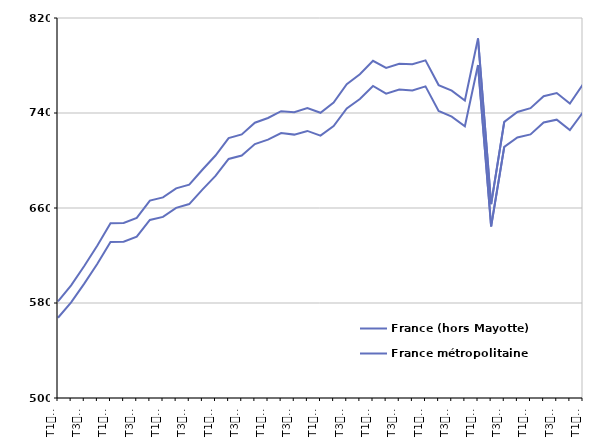
| Category | France (hors Mayotte) | France métropolitaine |
|---|---|---|
| T1
2012 | 581.4 | 567.6 |
| T2
2012 | 594.9 | 580.5 |
| T3
2012 | 611.2 | 596.3 |
| T4
2012 | 628.4 | 613 |
| T1
2013 | 647.1 | 631.4 |
| T2
2013 | 647.4 | 631.6 |
| T3
2013 | 651.7 | 635.8 |
| T4
2013 | 666.2 | 649.9 |
| T1
2014 | 668.9 | 652.5 |
| T2
2014 | 676.5 | 660.1 |
| T3
2014 | 679.7 | 663.3 |
| T4
2014 | 692.2 | 675.5 |
| T1
2015 | 704.2 | 687 |
| T2
2015 | 718.9 | 701.3 |
| T3
2015 | 722 | 704.2 |
| T4
2015 | 731.8 | 713.8 |
| T1
2016 | 735.8 | 717.6 |
| T2
2016 | 741.5 | 723.1 |
| T3
2016 | 740.6 | 721.8 |
| T4
2016 | 744.2 | 724.9 |
| T1
2017 | 740.2 | 720.9 |
| T2
2017 | 748.8 | 729 |
| T3
2017 | 764.2 | 743.9 |
| T4
2017 | 772.6 | 751.8 |
| T1
2018 | 784 | 762.8 |
| T2
2018 | 778 | 756.3 |
| T3
2018 | 781.4 | 759.8 |
| T4
2018 | 781.1 | 758.9 |
| T1
2019 | 784.3 | 762.4 |
| T2
2019 | 763.5 | 741.7 |
| T3
2019 | 758.8 | 736.9 |
| T4
2019 | 750.5 | 728.8 |
| T1
2020 | 802.8 | 780.4 |
| T2
2020 | 663.3 | 644.5 |
| T3
2020 | 732.5 | 711.5 |
| T4
2020 | 740.9 | 719.4 |
| T1
2021 | 744.1 | 722 |
| T2
2021 | 754.1 | 732 |
| T3
2021 | 756.8 | 734.4 |
| T4
2021 | 747.9 | 725.7 |
| T1
2022 | 764.1 | 740.6 |